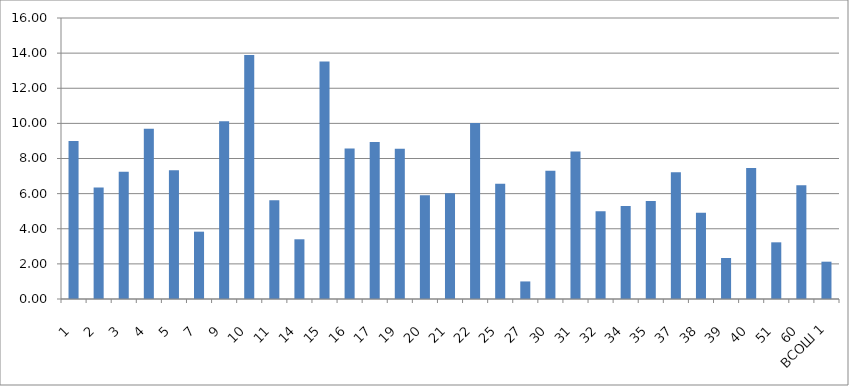
| Category | Series 0 |
|---|---|
| 1 | 9 |
| 2 | 6.348 |
| 3 | 7.25 |
| 4 | 9.688 |
| 5 | 7.333 |
| 7 | 3.833 |
| 9 | 10.12 |
| 10 | 13.896 |
| 11 | 5.625 |
| 14 | 3.4 |
| 15 | 13.527 |
| 16 | 8.574 |
| 17 | 8.946 |
| 19 | 8.549 |
| 20 | 5.909 |
| 21 | 6.021 |
| 22 | 10.027 |
| 25 | 6.567 |
| 27 | 1 |
| 30 | 7.302 |
| 31 | 8.4 |
| 32 | 5 |
| 34 | 5.293 |
| 35 | 5.578 |
| 37 | 7.211 |
| 38 | 4.909 |
| 39 | 2.333 |
| 40 | 7.455 |
| 51 | 3.227 |
| 60 | 6.476 |
| ВСОШ 1 | 2.125 |